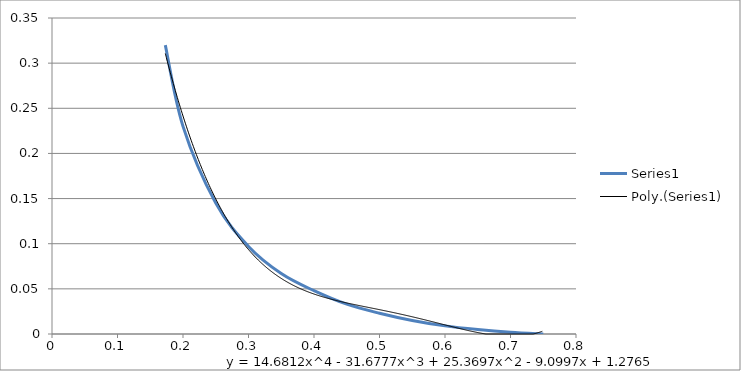
| Category | Series 0 |
|---|---|
| 0.173 | 0.32 |
| 0.2 | 0.23 |
| 0.25 | 0.145 |
| 0.3 | 0.097 |
| 0.35 | 0.067 |
| 0.4 | 0.048 |
| 0.45 | 0.033 |
| 0.5 | 0.023 |
| 0.55 | 0.015 |
| 0.6 | 0.009 |
| 0.65 | 0.005 |
| 0.7 | 0.002 |
| 0.75 | 0 |